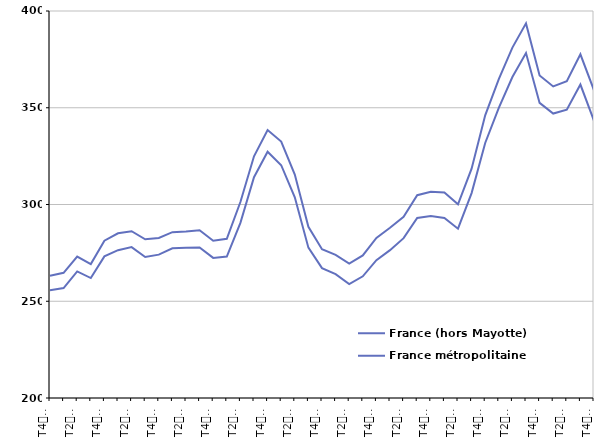
| Category | France (hors Mayotte) | France métropolitaine |
|---|---|---|
| T4
2012 | 263.2 | 255.7 |
| T1
2013 | 264.7 | 256.8 |
| T2
2013 | 273.1 | 265.4 |
| T3
2013 | 269.2 | 262 |
| T4
2013 | 281.3 | 273.2 |
| T1
2014 | 285.1 | 276.4 |
| T2
2014 | 286.2 | 278 |
| T3
2014 | 282 | 272.9 |
| T4
2014 | 282.7 | 274.1 |
| T1
2015 | 285.7 | 277.4 |
| T2
2015 | 286 | 277.6 |
| T3
2015 | 286.7 | 277.8 |
| T4
2015 | 281.3 | 272.4 |
| T1
2016 | 282.3 | 273.1 |
| T2
2016 | 301.3 | 290.5 |
| T3
2016 | 324.9 | 314.1 |
| T4
2016 | 338.5 | 327.3 |
| T1
2017 | 332.5 | 320.3 |
| T2
2017 | 315.5 | 303.7 |
| T3
2017 | 288.5 | 277.7 |
| T4
2017 | 276.9 | 267.1 |
| T1
2018 | 274 | 264 |
| T2
2018 | 269.5 | 258.9 |
| T3
2018 | 273.7 | 262.9 |
| T4
2018 | 282.7 | 271.2 |
| T1
2019 | 288 | 276.4 |
| T2
2019 | 293.6 | 282.6 |
| T3
2019 | 304.8 | 293 |
| T4
2019 | 306.6 | 294 |
| T1
2020 | 306.2 | 293 |
| T2
2020 | 300.1 | 287.5 |
| T3
2020 | 318.5 | 305.9 |
| T4
2020 | 346.1 | 331.8 |
| T1
2021 | 364.8 | 349.9 |
| T2
2021 | 381.1 | 365.9 |
| T3
2021 | 393.6 | 378.3 |
| T4
2021 | 366.7 | 352.5 |
| T1
2022 | 361 | 347 |
| T2
2022 | 363.7 | 349 |
| T3
2022 | 377.6 | 362 |
| T4
2022 | 359 | 343.3 |